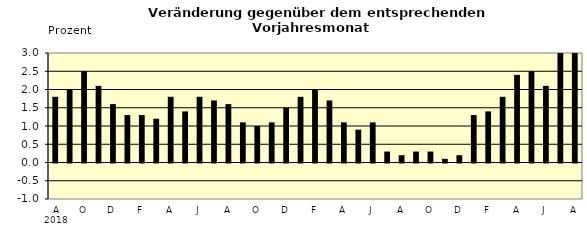
| Category | Series 0 |
|---|---|
| 0 | 1.8 |
| 1 | 2 |
| 2 | 2.5 |
| 3 | 2.1 |
| 4 | 1.6 |
| 5 | 1.3 |
| 6 | 1.3 |
| 7 | 1.2 |
| 8 | 1.8 |
| 9 | 1.4 |
| 10 | 1.8 |
| 11 | 1.7 |
| 12 | 1.6 |
| 13 | 1.1 |
| 14 | 1 |
| 15 | 1.1 |
| 16 | 1.5 |
| 17 | 1.8 |
| 18 | 2 |
| 19 | 1.7 |
| 20 | 1.1 |
| 21 | 0.9 |
| 22 | 1.1 |
| 23 | 0.3 |
| 24 | 0.2 |
| 25 | 0.3 |
| 26 | 0.3 |
| 27 | 0.1 |
| 28 | 0.2 |
| 29 | 1.3 |
| 30 | 1.4 |
| 31 | 1.8 |
| 32 | 2.4 |
| 33 | 2.5 |
| 34 | 2.1 |
| 35 | 3.7 |
| 36 | 3.8 |